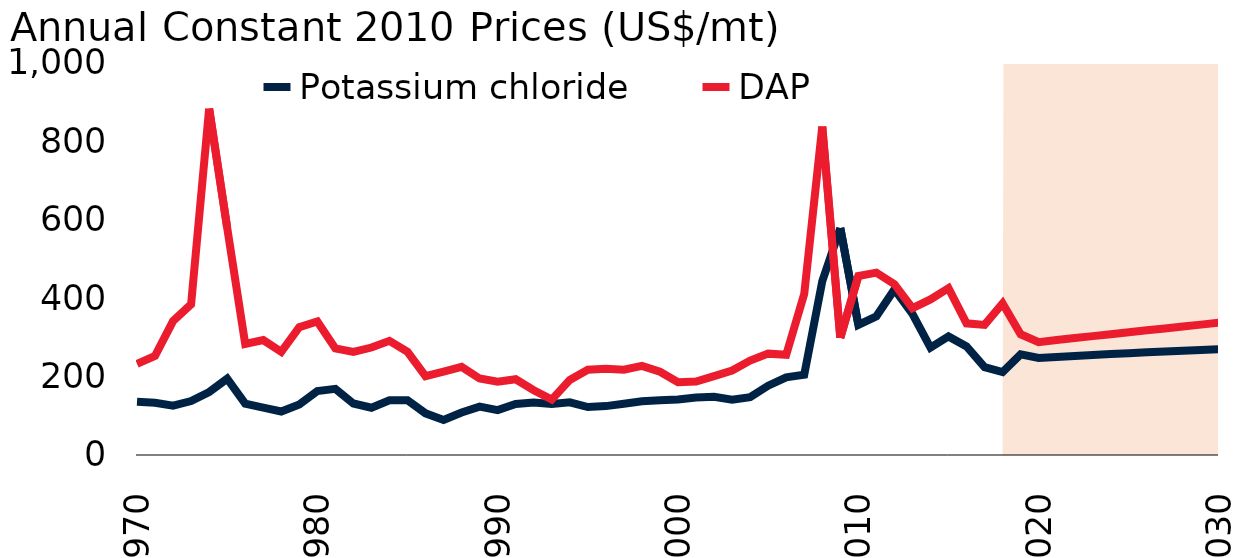
| Category | Potassium chloride | DAP |
|---|---|---|
| 1970.0 | 135.69 | 232.612 |
| 1971.0 | 133.117 | 252.922 |
| 1972.0 | 125.785 | 341.686 |
| 1973.0 | 137.6 | 384.471 |
| 1974.0 | 160.734 | 883.691 |
| 1975.0 | 194.564 | 580.104 |
| 1976.0 | 131.156 | 283.384 |
| 1977.0 | 120.881 | 293.128 |
| 1978.0 | 111.01 | 263.054 |
| 1979.0 | 128.955 | 326.033 |
| 1980.0 | 163.283 | 340.683 |
| 1981.0 | 168.712 | 272.019 |
| 1982.0 | 131.405 | 263.007 |
| 1983.0 | 120.662 | 274.157 |
| 1984.0 | 139.472 | 291.172 |
| 1985.0 | 139.406 | 263.315 |
| 1986.0 | 106.275 | 201.26 |
| 1987.0 | 89.448 | 212.68 |
| 1988.0 | 108.388 | 224.89 |
| 1989.0 | 123.483 | 195.009 |
| 1990.0 | 114.465 | 187.094 |
| 1991.0 | 129.931 | 193.195 |
| 1992.0 | 133.934 | 165.23 |
| 1993.0 | 130.373 | 141.325 |
| 1994.0 | 134.361 | 191.597 |
| 1995.0 | 122.389 | 217.333 |
| 1996.0 | 124.766 | 219.704 |
| 1997.0 | 130.933 | 217.627 |
| 1998.0 | 136.91 | 227.408 |
| 1999.0 | 139.593 | 212.306 |
| 2000.0 | 141.403 | 185.608 |
| 2001.0 | 146.911 | 187.406 |
| 2002.0 | 148.647 | 201.094 |
| 2003.0 | 141.3 | 215.612 |
| 2004.0 | 147.661 | 240.801 |
| 2005.0 | 176.73 | 258.58 |
| 2006.0 | 198.311 | 255.623 |
| 2007.0 | 204.775 | 410.734 |
| 2008.0 | 443.403 | 837.874 |
| 2009.0 | 578.962 | 299.049 |
| 2010.0 | 332.146 | 456.427 |
| 2011.0 | 353.908 | 465.142 |
| 2012.0 | 422.396 | 435.886 |
| 2013.0 | 360.091 | 374.652 |
| 2014.0 | 274.101 | 396.966 |
| 2015.0 | 302.545 | 425.744 |
| 2016.0 | 276.851 | 335.852 |
| 2017.0 | 224.236 | 331.918 |
| 2018.0 | 211.732 | 386.546 |
| 2019.0 | 256.841 | 307.962 |
| 2020.0 | 247.501 | 287.909 |
| 2021.0 | 250.203 | 293.153 |
| 2022.0 | 252.74 | 298.263 |
| 2023.0 | 255.154 | 303.284 |
| 2024.0 | 257.469 | 308.245 |
| 2025.0 | 259.702 | 313.162 |
| 2026.0 | 261.862 | 318.046 |
| 2027.0 | 263.959 | 322.907 |
| 2028.0 | 265.996 | 327.747 |
| 2029.0 | 267.978 | 332.572 |
| 2030.0 | 269.906 | 337.383 |